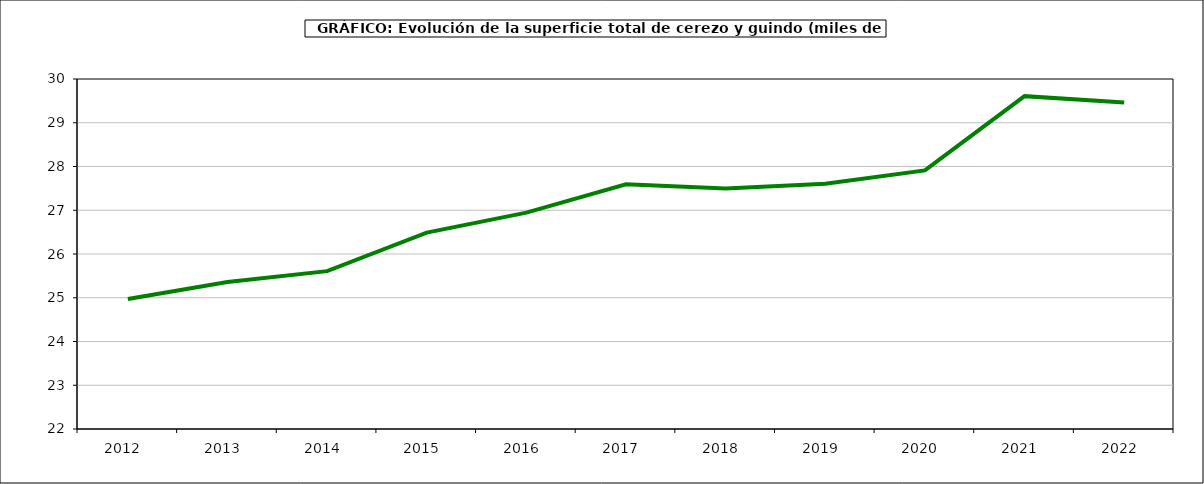
| Category | superficie cerezo y guindo |
|---|---|
| 2012.0 | 24.972 |
| 2013.0 | 25.358 |
| 2014.0 | 25.608 |
| 2015.0 | 26.49 |
| 2016.0 | 26.946 |
| 2017.0 | 27.592 |
| 2018.0 | 27.5 |
| 2019.0 | 27.604 |
| 2020.0 | 27.911 |
| 2021.0 | 29.608 |
| 2022.0 | 29.463 |